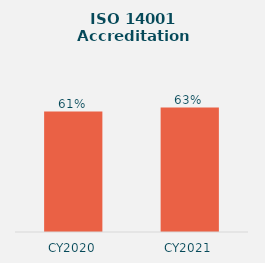
| Category | Series 0 |
|---|---|
| CY2020 | 0.61 |
| CY2021 | 0.63 |